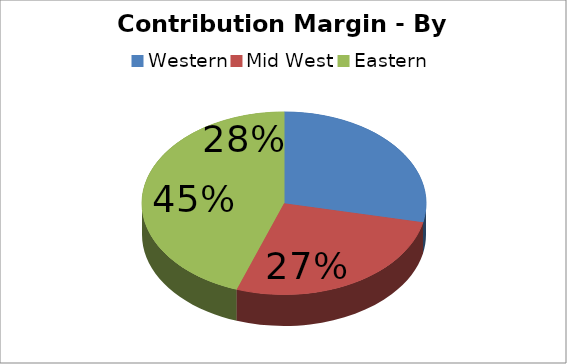
| Category | Series 0 |
|---|---|
| Western | 1275893 |
| Mid West | 1218603 |
| Eastern | 2008615 |